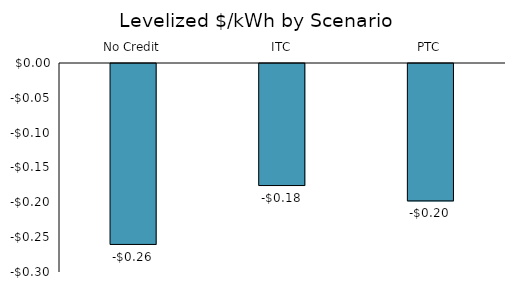
| Category | Series 0 |
|---|---|
| No Credit | -0.26 |
| ITC | -0.175 |
| PTC | -0.197 |